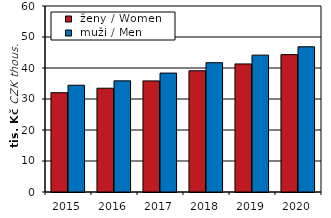
| Category |  ženy / Women |  muži / Men |
|---|---|---|
| 2015.0 | 32.032 | 34.438 |
| 2016.0 | 33.478 | 35.854 |
| 2017.0 | 35.841 | 38.359 |
| 2018.0 | 39.11 | 41.719 |
| 2019.0 | 41.306 | 44.152 |
| 2020.0 | 44.324 | 46.842 |